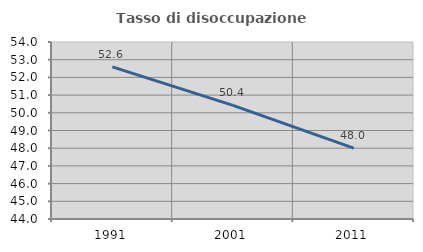
| Category | Tasso di disoccupazione giovanile  |
|---|---|
| 1991.0 | 52.597 |
| 2001.0 | 50.416 |
| 2011.0 | 48 |